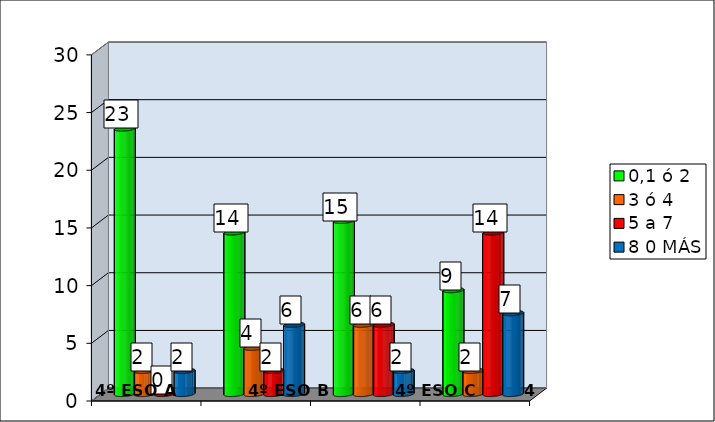
| Category | 0,1 ó 2  | 3 ó 4 | 5 a 7 | 8 0 MÁS |
|---|---|---|---|---|
|  | 23 | 2 | 0 | 2 |
|  | 14 | 4 | 2 | 6 |
|  | 15 | 6 | 6 | 2 |
|  | 9 | 2 | 14 | 7 |